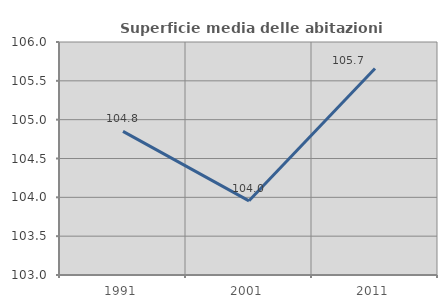
| Category | Superficie media delle abitazioni occupate |
|---|---|
| 1991.0 | 104.849 |
| 2001.0 | 103.955 |
| 2011.0 | 105.658 |